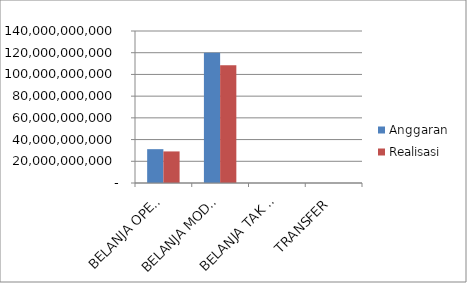
| Category | Anggaran | Realisasi  |
|---|---|---|
| BELANJA OPERASI | 31158545710 | 29077125184 |
| BELANJA MODAL | 120018163510 | 108399309790 |
| BELANJA TAK TERDUGA | 0 | 0 |
| TRANSFER | 0 | 0 |